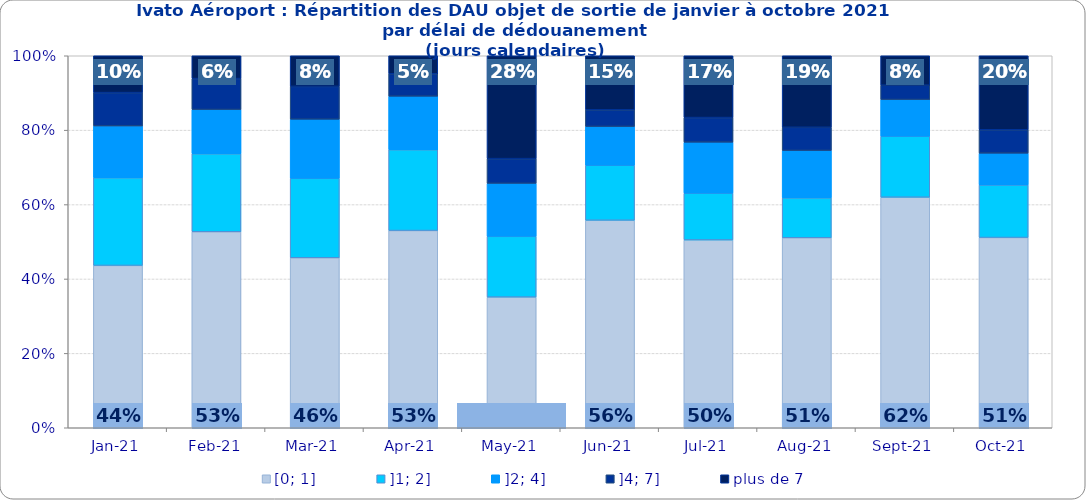
| Category | [0; 1] | ]1; 2] | ]2; 4] | ]4; 7] | plus de 7 |
|---|---|---|---|---|---|
| 2021-01-01 | 0.436 | 0.236 | 0.139 | 0.09 | 0.099 |
| 2021-02-01 | 0.527 | 0.21 | 0.119 | 0.083 | 0.061 |
| 2021-03-01 | 0.457 | 0.214 | 0.159 | 0.088 | 0.082 |
| 2021-04-01 | 0.53 | 0.217 | 0.144 | 0.06 | 0.048 |
| 2021-05-01 | 0.351 | 0.163 | 0.142 | 0.067 | 0.277 |
| 2021-06-01 | 0.558 | 0.148 | 0.104 | 0.045 | 0.145 |
| 2021-07-01 | 0.505 | 0.126 | 0.137 | 0.066 | 0.166 |
| 2021-08-01 | 0.511 | 0.107 | 0.127 | 0.062 | 0.192 |
| 2021-09-01 | 0.62 | 0.164 | 0.098 | 0.039 | 0.079 |
| 2021-10-01 | 0.511 | 0.141 | 0.086 | 0.063 | 0.199 |